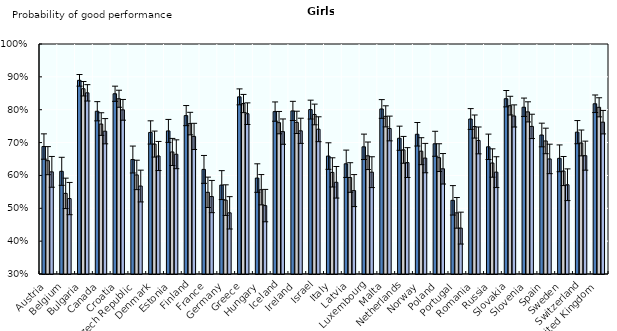
| Category | Healthy weight | Pre-obese | Obese |
|---|---|---|---|
| Austria | 0.688 | 0.645 | 0.611 |
| Belgium | 0.612 | 0.545 | 0.53 |
| Bulgaria | 0.889 | 0.864 | 0.851 |
| Canada | 0.795 | 0.756 | 0.735 |
| Croatia | 0.849 | 0.833 | 0.8 |
| Czech Republic | 0.648 | 0.602 | 0.568 |
| Denmark | 0.731 | 0.695 | 0.659 |
| Estonia | 0.735 | 0.671 | 0.664 |
| Finland | 0.782 | 0.758 | 0.719 |
| France | 0.618 | 0.549 | 0.536 |
| Germany | 0.571 | 0.525 | 0.486 |
| Greece | 0.839 | 0.819 | 0.788 |
| Hungary | 0.592 | 0.557 | 0.508 |
| Iceland | 0.794 | 0.761 | 0.733 |
| Ireland | 0.796 | 0.762 | 0.736 |
| Israel | 0.8 | 0.786 | 0.741 |
| Italy | 0.659 | 0.609 | 0.579 |
| Latvia | 0.635 | 0.594 | 0.554 |
| Luxembourg | 0.687 | 0.66 | 0.61 |
| Malta | 0.802 | 0.78 | 0.743 |
| Netherlands | 0.713 | 0.678 | 0.639 |
| Norway | 0.725 | 0.674 | 0.653 |
| Poland | 0.696 | 0.654 | 0.62 |
| Portugal | 0.524 | 0.486 | 0.44 |
| Romania | 0.772 | 0.749 | 0.707 |
| Russia | 0.687 | 0.638 | 0.61 |
| Slovakia | 0.834 | 0.812 | 0.781 |
| Slovenia | 0.808 | 0.793 | 0.749 |
| Spain | 0.723 | 0.705 | 0.65 |
| Sweden | 0.652 | 0.613 | 0.572 |
| Switzerland | 0.732 | 0.699 | 0.66 |
| United Kingdom | 0.818 | 0.807 | 0.762 |